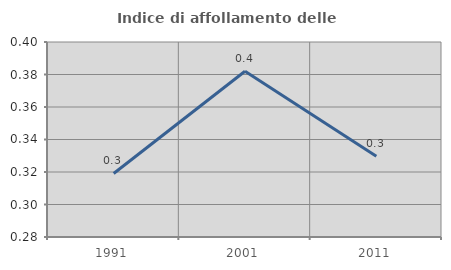
| Category | Indice di affollamento delle abitazioni  |
|---|---|
| 1991.0 | 0.319 |
| 2001.0 | 0.382 |
| 2011.0 | 0.33 |